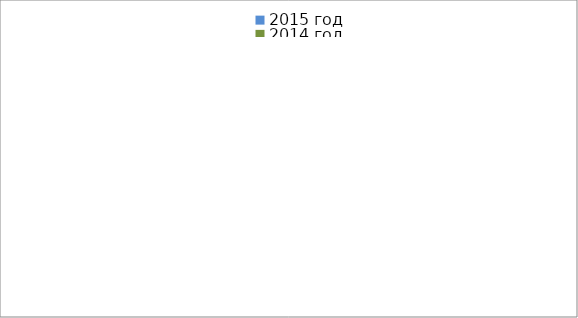
| Category | 2015 год | 2014 год |
|---|---|---|
|  - поджог | 2 | 3 |
|  - неосторожное обращение с огнём | 16 | 6 |
|  - НПТЭ электрооборудования | 1 | 4 |
|  - НПУ и Э печей | 17 | 23 |
|  - НПУ и Э транспортных средств | 24 | 24 |
|   -Шалость с огнем детей | 0 | 0 |
|  -НППБ при эксплуатации эл.приборов | 5 | 9 |
|  - курение | 6 | 4 |
| - прочие | 29 | 28 |
| - не установленные причины | 1 | 4 |